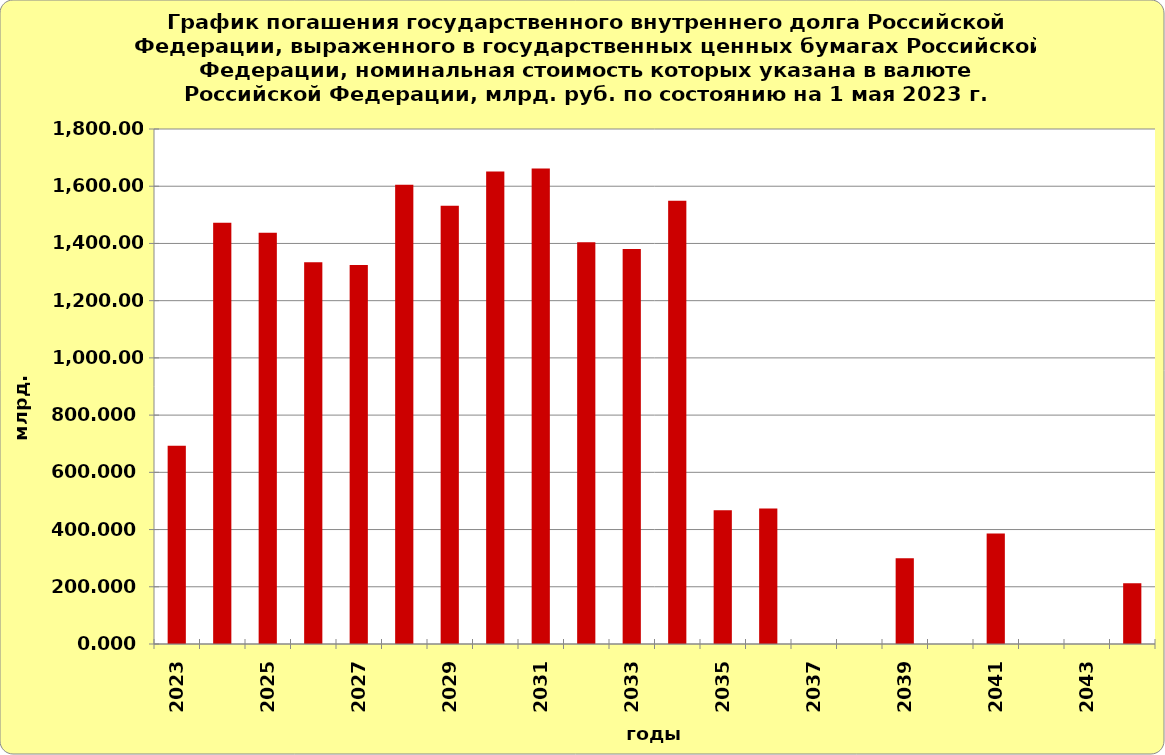
| Category | Series 1 |
|---|---|
| 2023.0 | 693.145 |
| 2024.0 | 1472.295 |
| 2025.0 | 1437.714 |
| 2026.0 | 1334.561 |
| 2027.0 | 1324.833 |
| 2028.0 | 1604.988 |
| 2029.0 | 1532.11 |
| 2030.0 | 1651.372 |
| 2031.0 | 1661.564 |
| 2032.0 | 1404.418 |
| 2033.0 | 1380.494 |
| 2034.0 | 1548.84 |
| 2035.0 | 467.105 |
| 2036.0 | 473.757 |
| 2037.0 | 0 |
| 2038.0 | 0 |
| 2039.0 | 300 |
| 2040.0 | 0 |
| 2041.0 | 386.359 |
| 2042.0 | 0 |
| 2043.0 | 0 |
| 2044.0 | 212.636 |